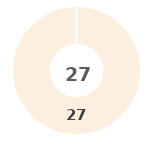
| Category | Series 0 |
|---|---|
| 0 | 0 |
| 1 | 0 |
| 2 | 0 |
| 3 | 0 |
| 4 | 27 |